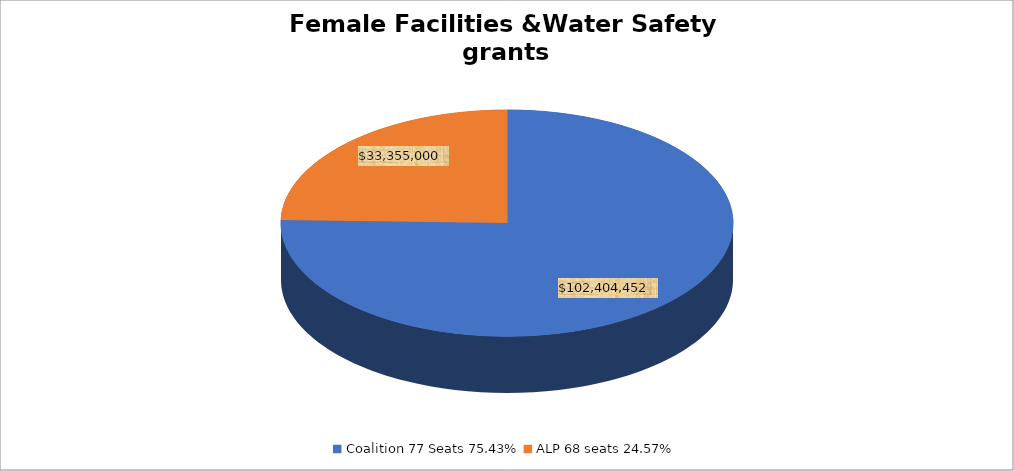
| Category | Female facilities &Water Safety grants |
|---|---|
| Coalition 77 Seats 75.43% | 102404452.05 |
| ALP 68 seats 24.57% | 33355000 |